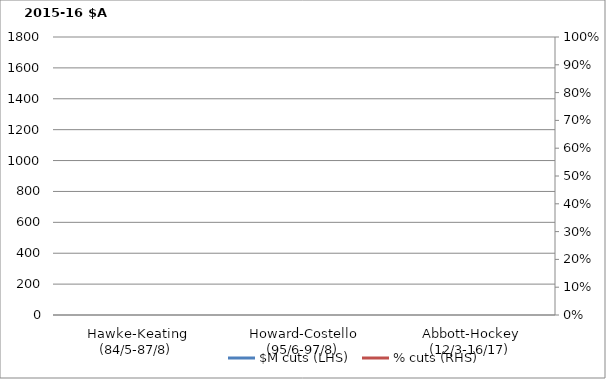
| Category | $M cuts (LHS) |
|---|---|
| Hawke-Keating (84/5-87/8) | 0 |
| Howard-Costello (95/6-97/8) | 0 |
| Abbott-Hockey (12/3-16/17) | 0 |